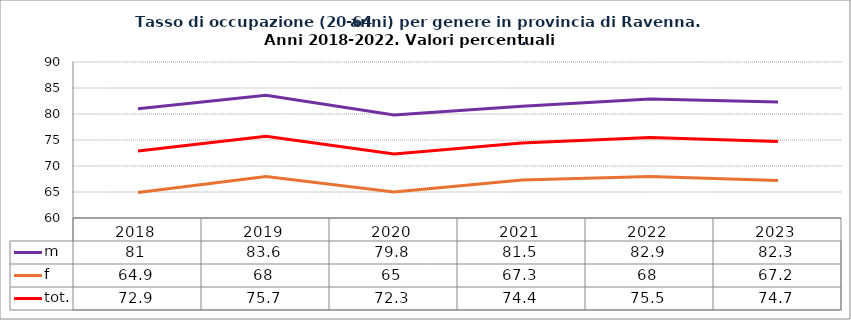
| Category | m | f | tot. |
|---|---|---|---|
| 2018.0 | 81 | 64.9 | 72.9 |
| 2019.0 | 83.6 | 68 | 75.7 |
| 2020.0 | 79.8 | 65 | 72.3 |
| 2021.0 | 81.5 | 67.3 | 74.4 |
| 2022.0 | 82.9 | 68 | 75.5 |
| 2023.0 | 82.3 | 67.2 | 74.7 |